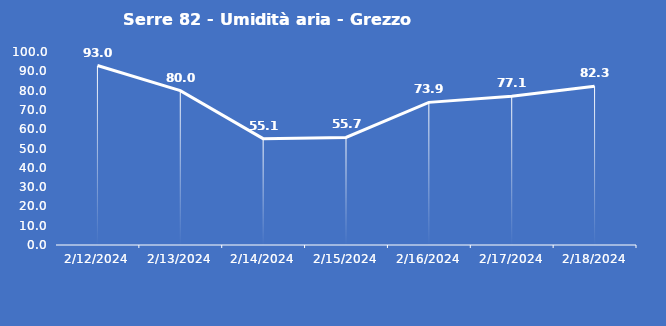
| Category | Serre 82 - Umidità aria - Grezzo (%) |
|---|---|
| 2/12/24 | 93 |
| 2/13/24 | 80 |
| 2/14/24 | 55.1 |
| 2/15/24 | 55.7 |
| 2/16/24 | 73.9 |
| 2/17/24 | 77.1 |
| 2/18/24 | 82.3 |